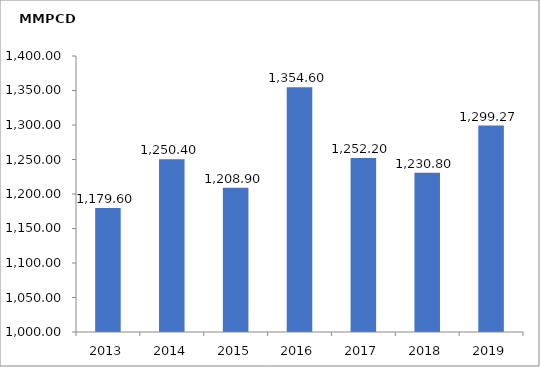
| Category | Series 0 |
|---|---|
| 2013.0 | 1179.6 |
| 2014.0 | 1250.4 |
| 2015.0 | 1208.9 |
| 2016.0 | 1354.6 |
| 2017.0 | 1252.2 |
| 2018.0 | 1230.8 |
| 2019.0 | 1299.274 |